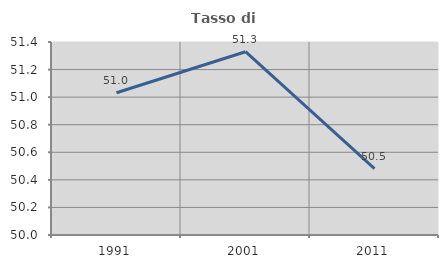
| Category | Tasso di occupazione   |
|---|---|
| 1991.0 | 51.032 |
| 2001.0 | 51.33 |
| 2011.0 | 50.481 |